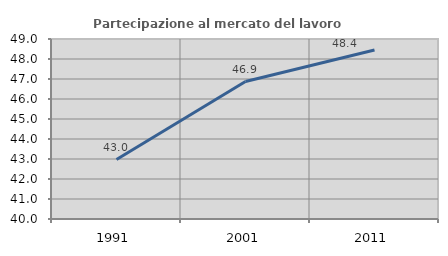
| Category | Partecipazione al mercato del lavoro  femminile |
|---|---|
| 1991.0 | 42.971 |
| 2001.0 | 46.871 |
| 2011.0 | 48.446 |